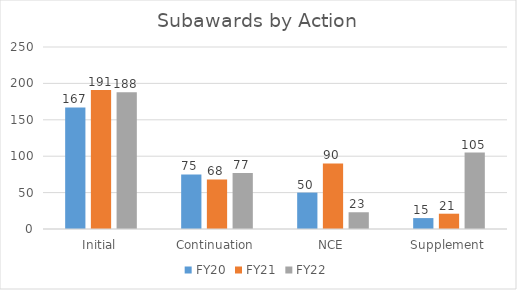
| Category | FY20 | FY21 | FY22 |
|---|---|---|---|
| Initial | 167 | 191 | 188 |
| Continuation | 75 | 68 | 77 |
| NCE | 50 | 90 | 23 |
| Supplement | 15 | 21 | 105 |